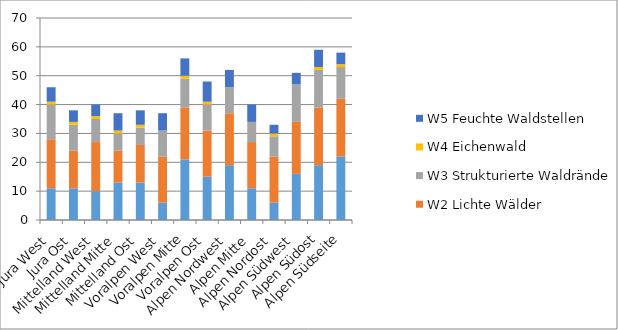
| Category | W1 Alt- und Totholz | W2 Lichte Wälder | W3 Strukturierte Waldränder | W4 Eichenwald | W5 Feuchte Waldstellen |
|---|---|---|---|---|---|
| Jura West | 11 | 17 | 12 | 1 | 5 |
| Jura Ost | 11 | 13 | 9 | 1 | 4 |
| Mittelland West | 10 | 17 | 8 | 1 | 4 |
| Mittelland Mitte | 13 | 11 | 6 | 1 | 6 |
| Mittelland Ost | 13 | 13 | 6 | 1 | 5 |
| Voralpen West | 6 | 16 | 9 | 0 | 6 |
| Voralpen Mitte | 21 | 18 | 10 | 1 | 6 |
| Voralpen Ost | 15 | 16 | 9 | 1 | 7 |
| Alpen Nordwest | 19 | 18 | 9 | 0 | 6 |
| Alpen Mitte | 11 | 16 | 7 | 0 | 6 |
| Alpen Nordost | 6 | 16 | 7 | 1 | 3 |
| Alpen Südwest | 16 | 18 | 13 | 0 | 4 |
| Alpen Südost | 19 | 20 | 13 | 1 | 6 |
| Alpen Südseite | 22 | 20 | 11 | 1 | 4 |